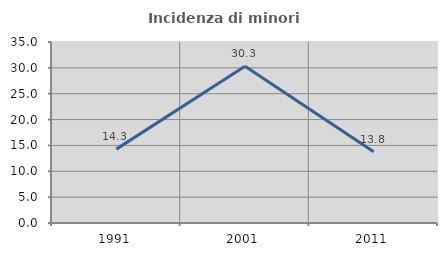
| Category | Incidenza di minori stranieri |
|---|---|
| 1991.0 | 14.286 |
| 2001.0 | 30.303 |
| 2011.0 | 13.793 |